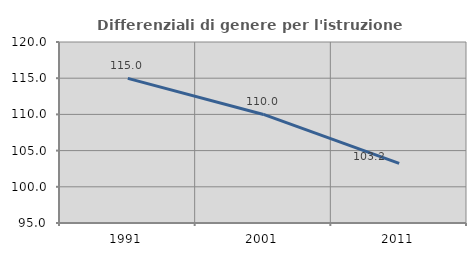
| Category | Differenziali di genere per l'istruzione superiore |
|---|---|
| 1991.0 | 114.973 |
| 2001.0 | 109.995 |
| 2011.0 | 103.243 |